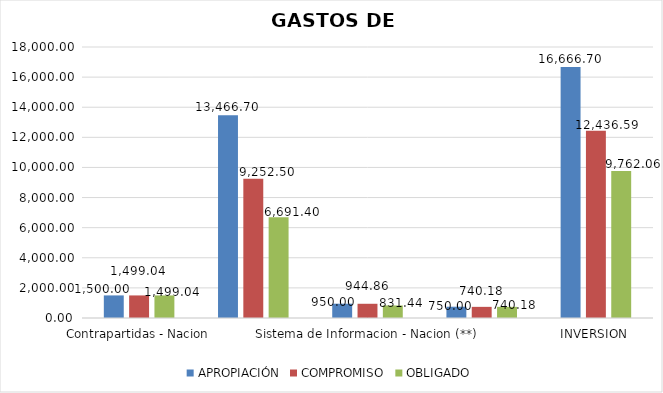
| Category | APROPIACIÓN | COMPROMISO | OBLIGADO |
|---|---|---|---|
| Contrapartidas - Nacion | 1500 | 1499.042 | 1499.042 |
| Admon Recursos de Cooperacion Internacional | 13466.7 | 9252.503 | 6691.396 |
| Sistema de Informacion - Nacion (**) | 950 | 944.864 | 831.442 |
| Consolidacion del Sistema Nacional -Nacion | 750 | 740.183 | 740.183 |
| INVERSION | 16666.7 | 12436.593 | 9762.064 |